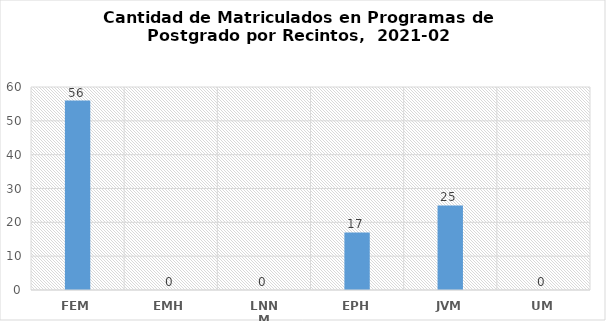
| Category | FEM |
|---|---|
| FEM | 56 |
| EMH | 0 |
| LNNM | 0 |
| EPH | 17 |
| JVM | 25 |
| UM | 0 |